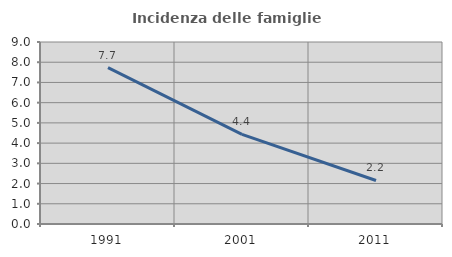
| Category | Incidenza delle famiglie numerose |
|---|---|
| 1991.0 | 7.731 |
| 2001.0 | 4.433 |
| 2011.0 | 2.153 |